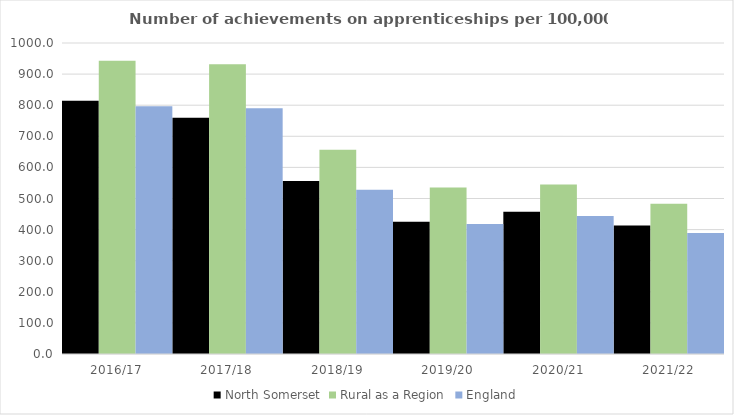
| Category | North Somerset | Rural as a Region | England |
|---|---|---|---|
| 2016/17 | 814 | 942.594 | 797 |
| 2017/18 | 760 | 931.709 | 790 |
| 2018/19 | 556 | 656.44 | 528 |
| 2019/20 | 425 | 535.552 | 418 |
| 2020/21 | 457 | 545.333 | 444 |
| 2021/22 | 413 | 482.936 | 389 |